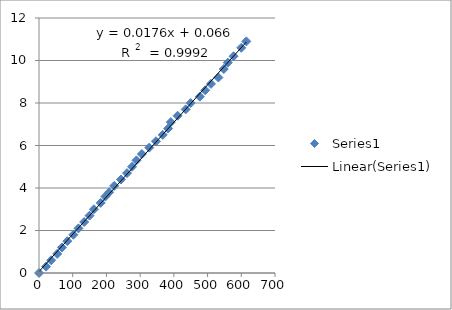
| Category | Series 0 |
|---|---|
| 0.0 | 0 |
| 21.0 | 0.3 |
| 36.0 | 0.6 |
| 54.0 | 0.9 |
| 68.0 | 1.2 |
| 84.0 | 1.5 |
| 102.0 | 1.8 |
| 117.0 | 2.1 |
| 134.0 | 2.4 |
| 150.0 | 2.7 |
| 163.0 | 3 |
| 183.0 | 3.3 |
| 197.0 | 3.6 |
| 208.0 | 3.8 |
| 223.0 | 4.1 |
| 243.0 | 4.4 |
| 261.0 | 4.7 |
| 276.0 | 5 |
| 289.0 | 5.3 |
| 305.0 | 5.6 |
| 327.0 | 5.9 |
| 347.0 | 6.2 |
| 367.0 | 6.5 |
| 383.0 | 6.8 |
| 391.0 | 7.1 |
| 411.0 | 7.4 |
| 435.0 | 7.7 |
| 450.0 | 8 |
| 477.0 | 8.3 |
| 493.0 | 8.6 |
| 510.0 | 8.9 |
| 532.0 | 9.2 |
| 548.0 | 9.6 |
| 560.0 | 9.9 |
| 577.0 | 10.2 |
| 600.0 | 10.6 |
| 615.0 | 10.9 |